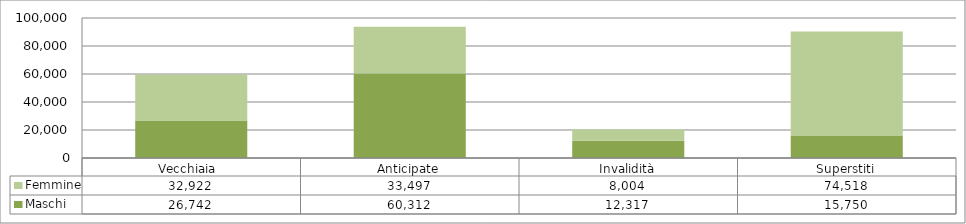
| Category | Maschi | Femmine |
|---|---|---|
| Vecchiaia  | 26742 | 32922 |
| Anticipate | 60312 | 33497 |
| Invalidità | 12317 | 8004 |
| Superstiti | 15750 | 74518 |